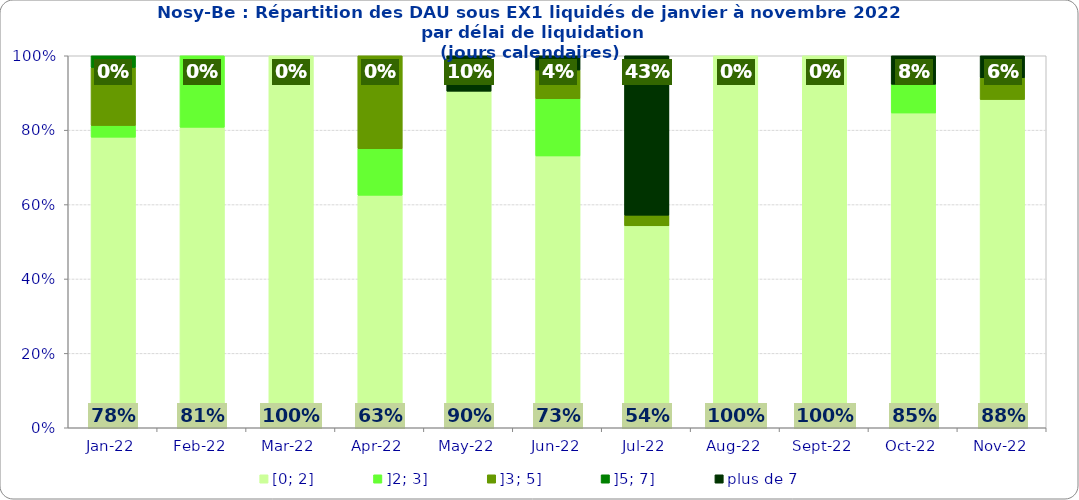
| Category | [0; 2] | ]2; 3] | ]3; 5] | ]5; 7] | plus de 7 |
|---|---|---|---|---|---|
| 2022-01-01 | 0.781 | 0.031 | 0.156 | 0.031 | 0 |
| 2022-02-01 | 0.808 | 0.192 | 0 | 0 | 0 |
| 2022-03-01 | 1 | 0 | 0 | 0 | 0 |
| 2022-04-01 | 0.625 | 0.125 | 0.25 | 0 | 0 |
| 2022-05-01 | 0.905 | 0 | 0 | 0 | 0.095 |
| 2022-06-01 | 0.731 | 0.154 | 0.077 | 0 | 0.038 |
| 2022-07-01 | 0.543 | 0 | 0.029 | 0 | 0.429 |
| 2022-08-01 | 1 | 0 | 0 | 0 | 0 |
| 2022-09-01 | 1 | 0 | 0 | 0 | 0 |
| 2022-10-01 | 0.846 | 0.077 | 0 | 0 | 0.077 |
| 2022-11-01 | 0.882 | 0 | 0.059 | 0 | 0.059 |